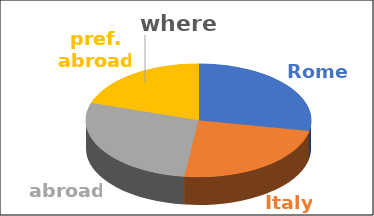
| Category | where | Series 1 | Series 2 | Series 3 | Series 4 |
|---|---|---|---|---|---|
| Rome | 0.28 |  |  |  |  |
| Italy | 0.24 |  |  |  |  |
| abroad | 0.28 |  |  |  |  |
| pref. abroad | 0.2 |  |  |  |  |